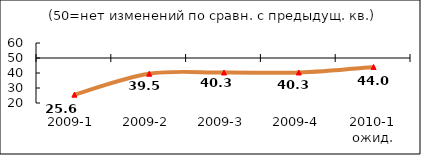
| Category | Диф.индекс ↓ |
|---|---|
| 2009-1 | 25.55 |
| 2009-2 | 39.51 |
| 2009-3 | 40.34 |
| 2009-4 | 40.345 |
| 2010-1 ожид. | 44.01 |